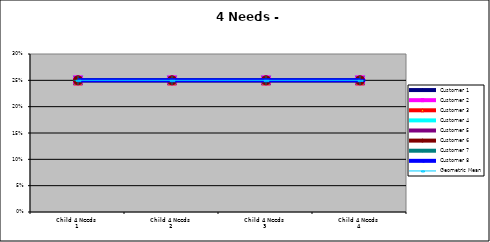
| Category | Customer 1 | Customer 2 | Customer 3 | Customer 4 | Customer 5 | Customer 6 | Customer 7 | Customer 8 | Geometric Mean |
|---|---|---|---|---|---|---|---|---|---|
| Child 4 Needs 1 | 0.25 | 0.25 | 0.25 | 0.25 | 0.25 | 0.25 | 0.25 | 0.25 | 0.25 |
| Child 4 Needs 2 | 0.25 | 0.25 | 0.25 | 0.25 | 0.25 | 0.25 | 0.25 | 0.25 | 0.25 |
| Child 4 Needs 3 | 0.25 | 0.25 | 0.25 | 0.25 | 0.25 | 0.25 | 0.25 | 0.25 | 0.25 |
| Child 4 Needs 4 | 0.25 | 0.25 | 0.25 | 0.25 | 0.25 | 0.25 | 0.25 | 0.25 | 0.25 |